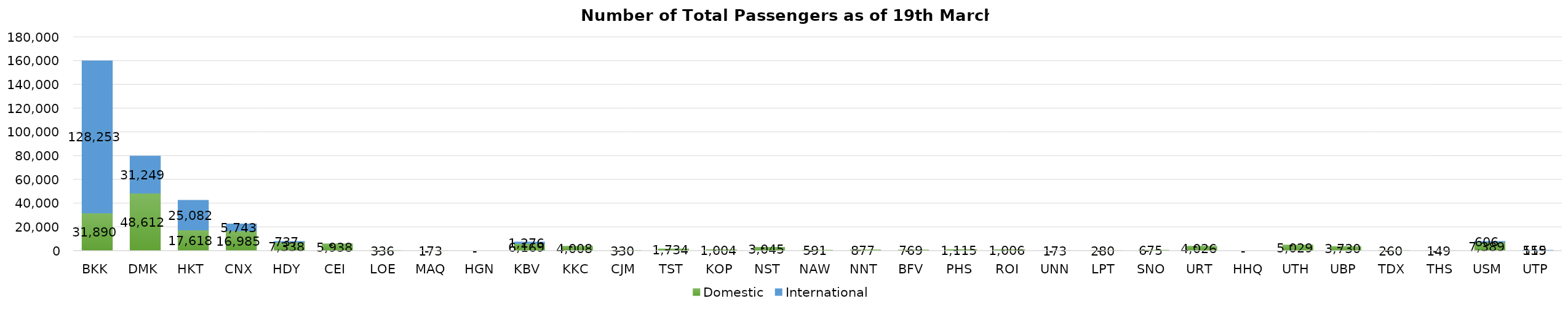
| Category | Domestic | International |
|---|---|---|
| BKK | 31890 | 128253 |
| DMK | 48612 | 31249 |
| HKT | 17618 | 25082 |
| CNX | 16985 | 5743 |
| HDY | 7338 | 737 |
| CEI | 5938 | 0 |
| LOE | 336 | 0 |
| MAQ | 173 | 0 |
| HGN | 0 | 0 |
| KBV | 6169 | 1276 |
| KKC | 4008 | 0 |
| CJM | 330 | 0 |
| TST | 1734 | 0 |
| KOP | 1004 | 0 |
| NST | 3045 | 0 |
| NAW | 591 | 0 |
| NNT | 877 | 0 |
| BFV | 769 | 0 |
| PHS | 1115 | 0 |
| ROI | 1006 | 0 |
| UNN | 173 | 0 |
| LPT | 280 | 0 |
| SNO | 675 | 0 |
| URT | 4026 | 0 |
| HHQ | 0 | 0 |
| UTH | 5029 | 0 |
| UBP | 3730 | 0 |
| TDX | 260 | 0 |
| THS | 149 | 0 |
| USM | 7389 | 606 |
| UTP | 519 | 155 |